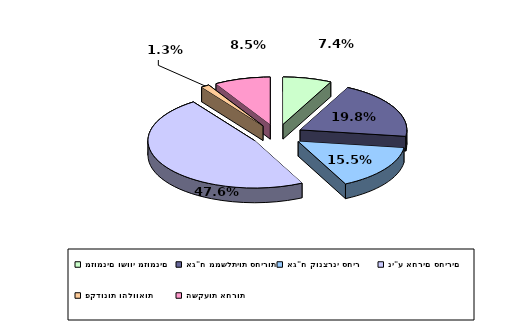
| Category | Series 0 |
|---|---|
| מזומנים ושווי מזומנים | 0.074 |
| אג"ח ממשלתיות סחירות | 0.198 |
| אג"ח קונצרני סחיר | 0.155 |
| ני"ע אחרים סחירים | 0.476 |
| פקדונות והלוואות | 0.013 |
| השקעות אחרות | 0.085 |